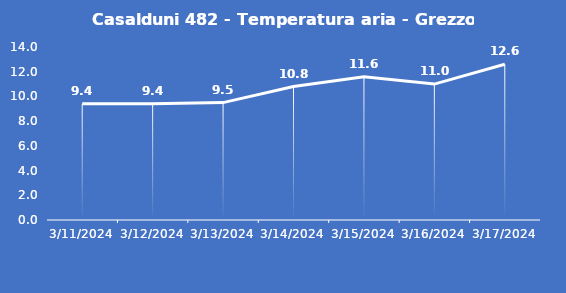
| Category | Casalduni 482 - Temperatura aria - Grezzo (°C) |
|---|---|
| 3/11/24 | 9.4 |
| 3/12/24 | 9.4 |
| 3/13/24 | 9.5 |
| 3/14/24 | 10.8 |
| 3/15/24 | 11.6 |
| 3/16/24 | 11 |
| 3/17/24 | 12.6 |